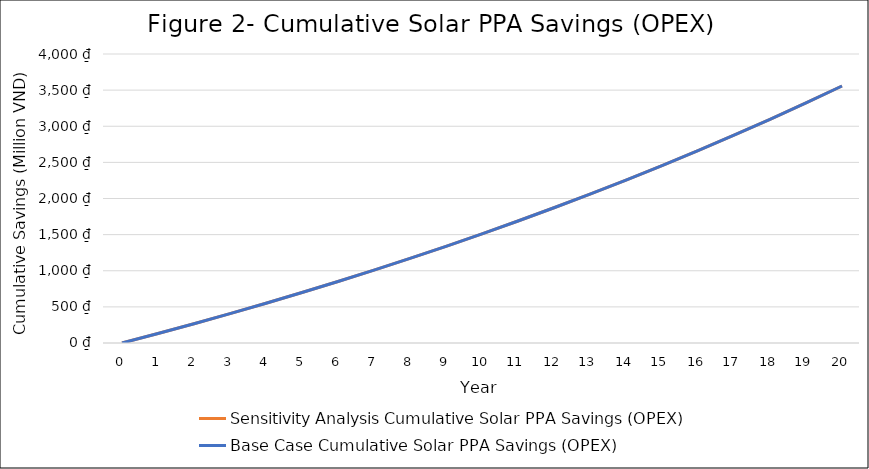
| Category | Sensitivity Analysis Cumulative Solar PPA Savings (OPEX) | Base Case Cumulative Solar PPA Savings (OPEX) |
|---|---|---|
| 0.0 | 0 | 0 |
| 1.0 | 131283126 | 131283126 |
| 2.0 | 266612397.943 | 266612397.943 |
| 3.0 | 406112518.048 | 406112518.048 |
| 4.0 | 549912031.854 | 549912031.854 |
| 5.0 | 698143446.676 | 698143446.676 |
| 6.0 | 850943353.702 | 850943353.702 |
| 7.0 | 1008452553.864 | 1008452553.864 |
| 8.0 | 1170816187.574 | 1170816187.574 |
| 9.0 | 1338183868.475 | 1338183868.475 |
| 10.0 | 1510709821.301 | 1510709821.301 |
| 11.0 | 1688553023.994 | 1688553023.994 |
| 12.0 | 1871877354.193 | 1871877354.193 |
| 13.0 | 2060851740.249 | 2060851740.249 |
| 14.0 | 2255650316.884 | 2255650316.884 |
| 15.0 | 2456452585.65 | 2456452585.65 |
| 16.0 | 2663443580.34 | 2663443580.34 |
| 17.0 | 2876814037.486 | 2876814037.486 |
| 18.0 | 3096760572.121 | 3096760572.121 |
| 19.0 | 3323485858.954 | 3323485858.954 |
| 20.0 | 3557198819.127 | 3557198819.127 |